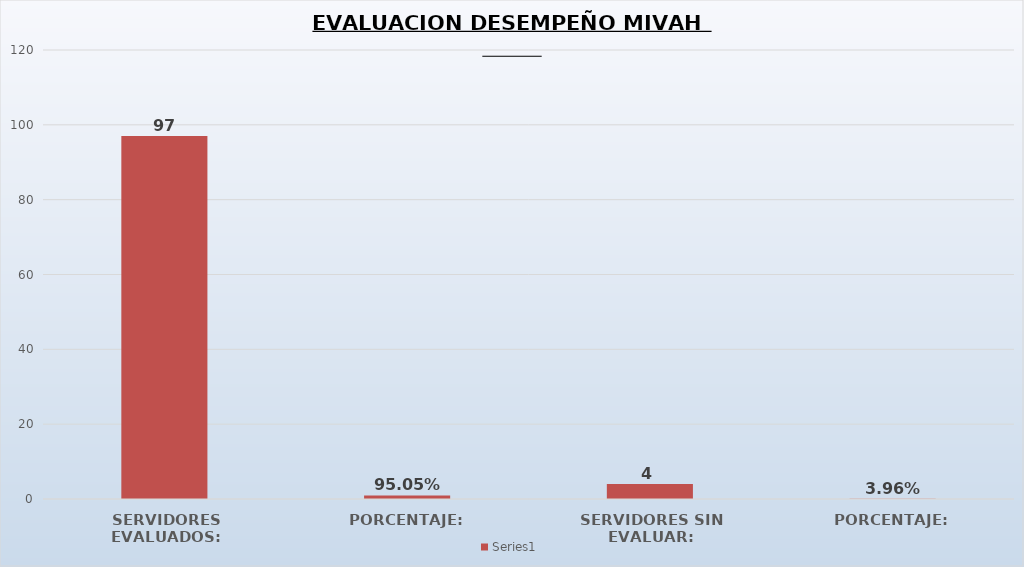
| Category | Series 1 |
|---|---|
| SERVIDORES EVALUADOS: | 97 |
| PORCENTAJE: | 0.95 |
| SERVIDORES SIN EVALUAR: | 4 |
| PORCENTAJE: | 0.04 |